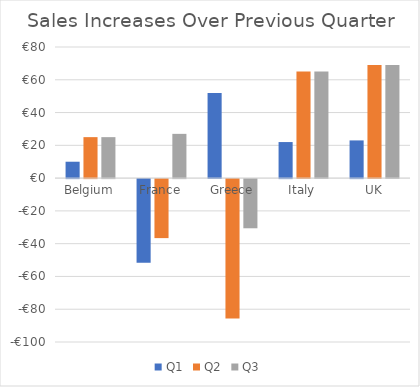
| Category | Q1 | Q2 | Q3 |
|---|---|---|---|
| Belgium | 10 | 25 | 25 |
| France | -51 | -36 | 27 |
| Greece | 52 | -85 | -30 |
| Italy | 22 | 65 | 65 |
| UK | 23 | 69 | 69 |